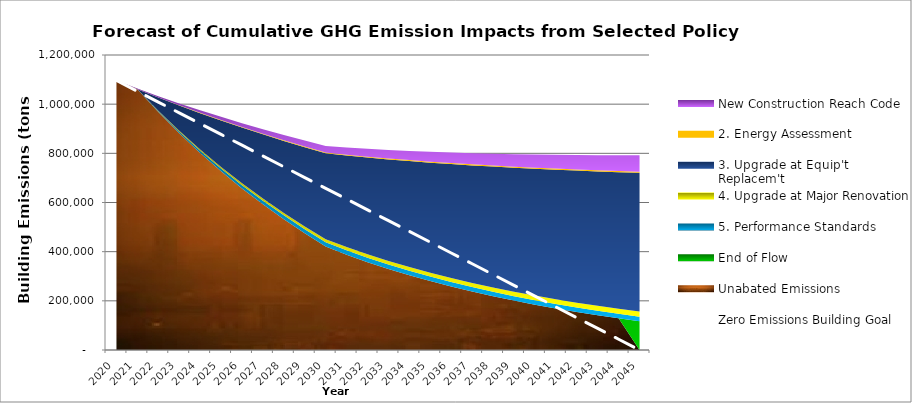
| Category | Zero Emissions Building Goal |
|---|---|
| 2020.0 | 1096122.776 |
| 2021.0 | 1052277.865 |
| 2022.0 | 1008432.954 |
| 2023.0 | 964588.043 |
| 2024.0 | 920743.132 |
| 2025.0 | 876898.221 |
| 2026.0 | 833053.31 |
| 2027.0 | 789208.399 |
| 2028.0 | 745363.488 |
| 2029.0 | 701518.577 |
| 2030.0 | 657673.666 |
| 2031.0 | 613828.755 |
| 2032.0 | 569983.844 |
| 2033.0 | 526138.933 |
| 2034.0 | 482294.022 |
| 2035.0 | 438449.111 |
| 2036.0 | 394604.199 |
| 2037.0 | 350759.288 |
| 2038.0 | 306914.377 |
| 2039.0 | 263069.466 |
| 2040.0 | 219224.555 |
| 2041.0 | 175379.644 |
| 2042.0 | 131534.733 |
| 2043.0 | 87689.822 |
| 2044.0 | 43844.911 |
| 2045.0 | 0 |